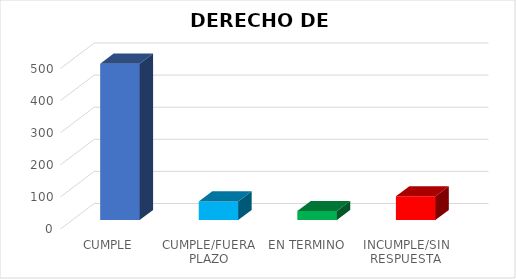
| Category | TOTAL |
|---|---|
| CUMPLE | 487 |
| CUMPLE/FUERA PLAZO | 58 |
| EN TERMINO | 28 |
| INCUMPLE/SIN RESPUESTA | 74 |